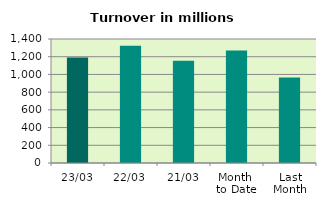
| Category | Series 0 |
|---|---|
| 23/03 | 1190.361 |
| 22/03 | 1324.706 |
| 21/03 | 1154.967 |
| Month 
to Date | 1270.274 |
| Last
Month | 966.674 |